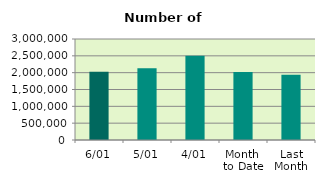
| Category | Series 0 |
|---|---|
| 6/01 | 2028996 |
| 5/01 | 2132588 |
| 4/01 | 2499104 |
| Month 
to Date | 2022250 |
| Last
Month | 1934937.048 |